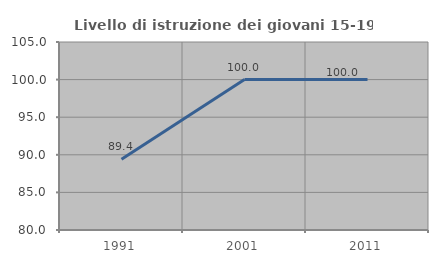
| Category | Livello di istruzione dei giovani 15-19 anni |
|---|---|
| 1991.0 | 89.423 |
| 2001.0 | 100 |
| 2011.0 | 100 |